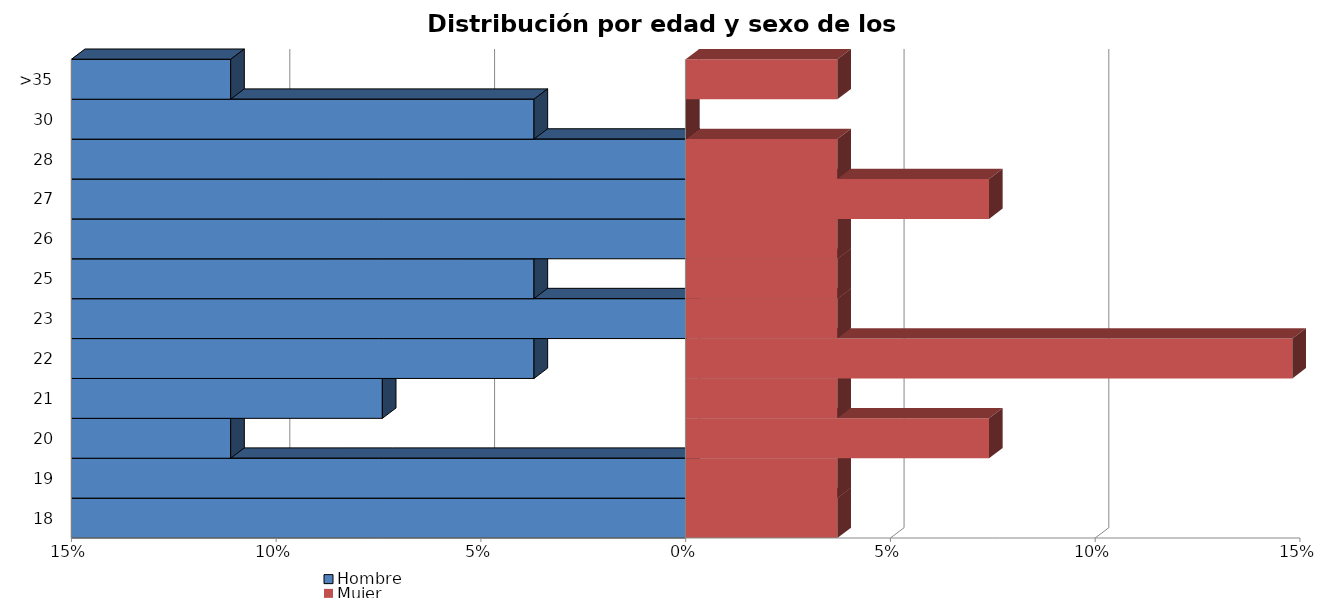
| Category | Hombre | Mujer |
|---|---|---|
| 18 | 0 | 0.037 |
| 19 | 0 | 0.037 |
| 20 | -0.111 | 0.074 |
| 21 | -0.074 | 0.037 |
| 22 | -0.037 | 0.148 |
| 23 | 0 | 0.037 |
| 25 | -0.037 | 0.037 |
| 26 | 0 | 0.037 |
| 27 | 0 | 0.074 |
| 28 | 0 | 0.037 |
| 30 | -0.037 | 0 |
| >35 | -0.111 | 0.037 |